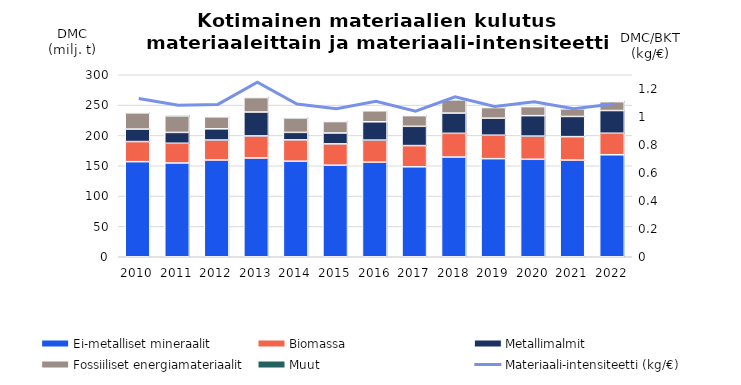
| Category | Ei-metalliset mineraalit | Biomassa | Metallimalmit | Fossiiliset energiamateriaalit | Muut |
|---|---|---|---|---|---|
| 2010.0 | 156.74 | 33.144 | 20.559 | 26.607 | 1.465 |
| 2011.0 | 154.581 | 32.46 | 17.911 | 26.972 | 2.042 |
| 2012.0 | 159.487 | 32.918 | 18.498 | 19.735 | 1.453 |
| 2013.0 | 162.801 | 36.38 | 39.414 | 23.82 | 1.197 |
| 2014.0 | 157.486 | 35.172 | 12.379 | 23.511 | 1.116 |
| 2015.0 | 150.975 | 35.127 | 17.916 | 18.823 | 1.077 |
| 2016.0 | 155.898 | 36.37 | 30.219 | 18.12 | 1.06 |
| 2017.0 | 148.284 | 34.941 | 31.776 | 17.642 | 1.008 |
| 2018.0 | 164.388 | 39.049 | 33.381 | 21.773 | 0.891 |
| 2019.0 | 161.686 | 38.668 | 28.086 | 17.488 | 0.996 |
| 2020.0 | 160.684 | 38.167 | 33.745 | 14.892 | 1.036 |
| 2021.0 | 159.372 | 38.606 | 33.284 | 12.403 | 1.241 |
| 2022.0 | 168.136 | 35.441 | 37.462 | 14.591 | 1.344 |